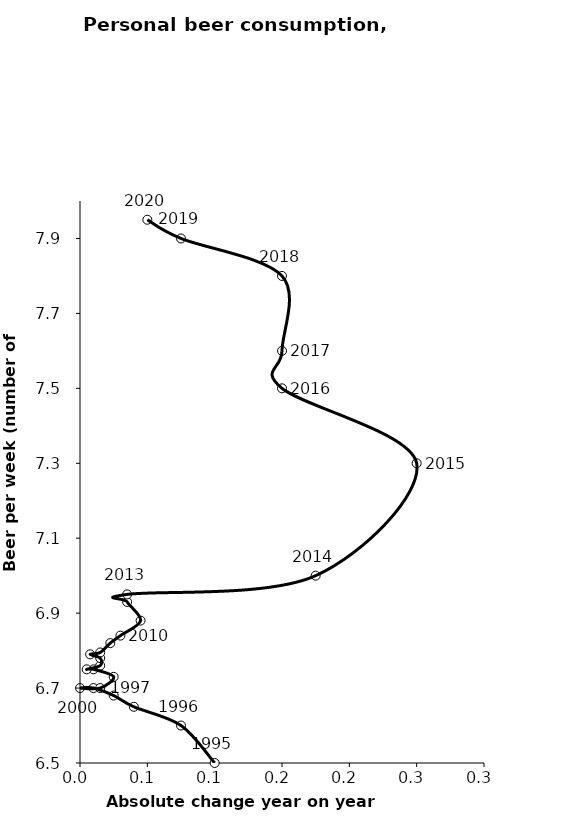
| Category | Series 0 |
|---|---|
| 0.09999999999999964 | 6.5 |
| 0.07500000000000018 | 6.6 |
| 0.040000000000000036 | 6.65 |
| 0.02499999999999991 | 6.68 |
| 0.010000000000000231 | 6.7 |
| 0.0 | 6.7 |
| 0.015000000000000124 | 6.7 |
| 0.02499999999999991 | 6.73 |
| 0.009999999999999787 | 6.75 |
| 0.004999999999999893 | 6.75 |
| 0.015000000000000124 | 6.76 |
| 0.015000000000000124 | 6.78 |
| 0.00749999999999984 | 6.79 |
| 0.015000000000000124 | 6.795 |
| 0.022499999999999964 | 6.82 |
| 0.029999999999999805 | 6.84 |
| 0.04499999999999993 | 6.88 |
| 0.03500000000000014 | 6.93 |
| 0.03500000000000014 | 6.95 |
| 0.17499999999999982 | 7 |
| 0.25 | 7.3 |
| 0.1499999999999999 | 7.5 |
| 0.1499999999999999 | 7.6 |
| 0.15000000000000036 | 7.8 |
| 0.07500000000000018 | 7.9 |
| 0.04999999999999982 | 7.95 |